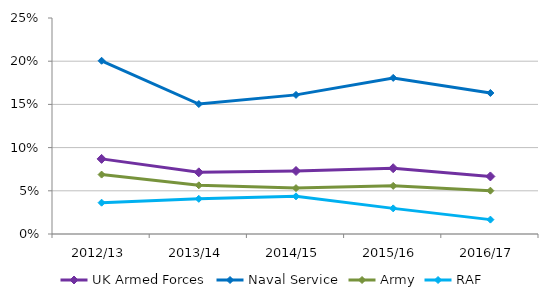
| Category | UK Armed Forces | Naval Service | Army | RAF |
|---|---|---|---|---|
| 2012/13 | 0.087 | 0.201 | 0.069 | 0.036 |
| 2013/14 | 0.071 | 0.15 | 0.056 | 0.041 |
| 2014/15 | 0.073 | 0.161 | 0.053 | 0.044 |
| 2015/16 | 0.076 | 0.181 | 0.056 | 0.03 |
| 2016/17 | 0.067 | 0.163 | 0.05 | 0.017 |